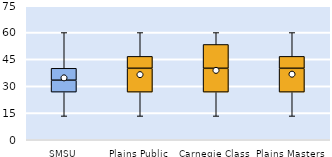
| Category | 25th | 50th | 75th |
|---|---|---|---|
| SMSU | 26.667 | 6.667 | 6.667 |
| Plains Public | 26.667 | 13.333 | 6.667 |
| Carnegie Class | 26.667 | 13.333 | 13.333 |
| Plains Masters | 26.667 | 13.333 | 6.667 |